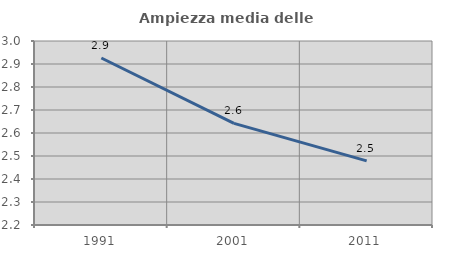
| Category | Ampiezza media delle famiglie |
|---|---|
| 1991.0 | 2.926 |
| 2001.0 | 2.642 |
| 2011.0 | 2.479 |